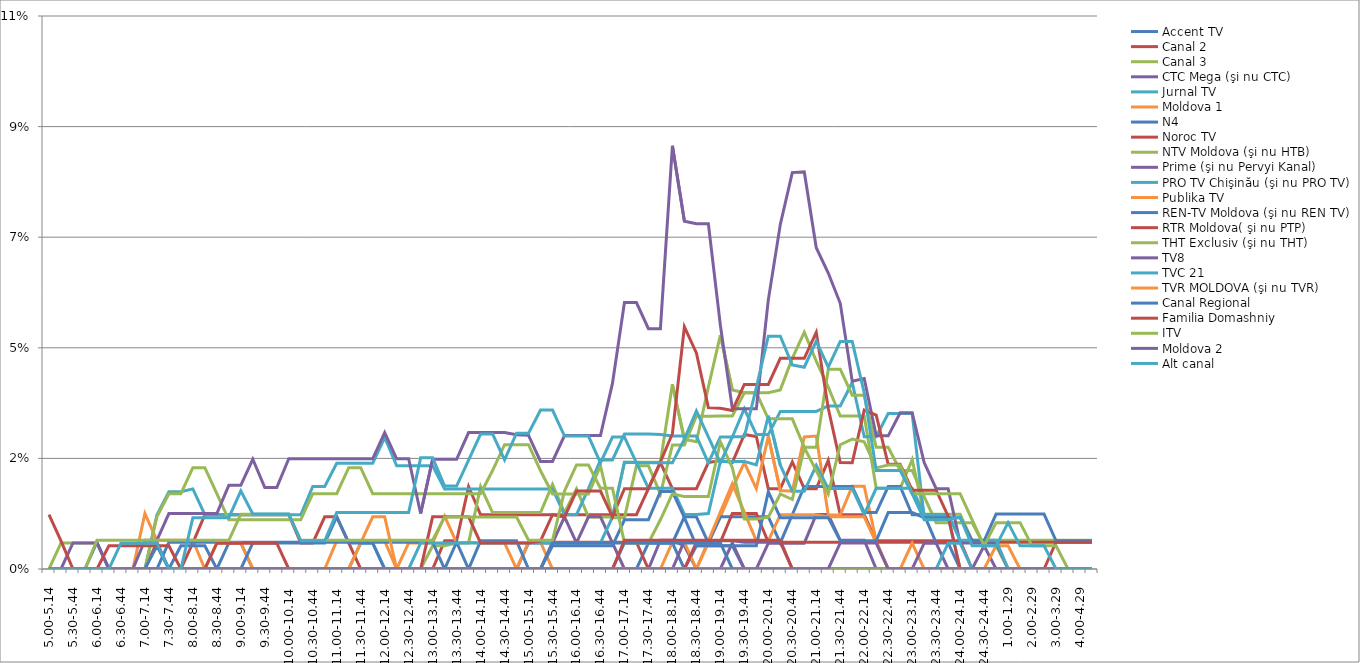
| Category | Accent TV | Canal 2 | Canal 3 | CTC Mega (şi nu CTC) | Jurnal TV | Moldova 1 | N4 | Noroc TV | NTV Moldova (şi nu HTB) | Prime (şi nu Pervyi Kanal) | PRO TV Chişinău (şi nu PRO TV) | Publika TV  | REN-TV Moldova (şi nu REN TV)  | RTR Moldova( şi nu PTP)  | THT Exclusiv (şi nu THT) | TV8 | TVC 21 | TVR MOLDOVA (şi nu TVR) | Canal Regional | Familia Domashniy | ITV | Moldova 2 | Alt canal |
|---|---|---|---|---|---|---|---|---|---|---|---|---|---|---|---|---|---|---|---|---|---|---|---|
| 5.00-5.14 | 0 | 0 | 0 | 0 | 0 | 0 | 0 | 0 | 0 | 0 | 0 | 0 | 0 | 0.011 | 0 | 0 | 0 | 0 | 0 | 0 | 0 | 0 | 0 |
| 5.15-5.29 | 0 | 0 | 0.005 | 0 | 0 | 0 | 0 | 0 | 0 | 0 | 0 | 0 | 0 | 0.006 | 0 | 0 | 0 | 0 | 0 | 0 | 0 | 0 | 0 |
| 5.30-5.44 | 0 | 0 | 0.005 | 0 | 0 | 0 | 0 | 0 | 0 | 0.005 | 0 | 0 | 0 | 0 | 0 | 0 | 0 | 0 | 0 | 0 | 0 | 0 | 0 |
| 5.45-5.59 | 0 | 0 | 0.005 | 0 | 0 | 0 | 0 | 0 | 0 | 0.005 | 0 | 0 | 0 | 0 | 0 | 0 | 0 | 0 | 0 | 0 | 0 | 0 | 0 |
| 6.00-6.14 | 0 | 0 | 0.005 | 0 | 0 | 0 | 0.005 | 0 | 0 | 0.005 | 0 | 0 | 0 | 0 | 0.006 | 0 | 0 | 0 | 0 | 0 | 0 | 0 | 0 |
| 6.15-6.29 | 0 | 0 | 0 | 0 | 0 | 0 | 0 | 0 | 0 | 0 | 0 | 0 | 0 | 0.005 | 0.006 | 0 | 0 | 0 | 0 | 0 | 0 | 0 | 0 |
| 6.30-6.44 | 0 | 0 | 0 | 0 | 0 | 0 | 0 | 0 | 0 | 0 | 0 | 0 | 0 | 0.005 | 0.006 | 0 | 0 | 0 | 0 | 0 | 0 | 0 | 0.005 |
| 6.45-6.59 | 0 | 0 | 0 | 0 | 0 | 0 | 0 | 0 | 0 | 0 | 0 | 0 | 0 | 0.005 | 0.006 | 0 | 0 | 0 | 0 | 0 | 0 | 0 | 0.005 |
| 7.00-7.14 | 0 | 0 | 0 | 0 | 0 | 0.011 | 0 | 0 | 0 | 0.006 | 0 | 0 | 0 | 0.005 | 0.006 | 0 | 0 | 0 | 0 | 0 | 0 | 0 | 0.005 |
| 7.15-7.29 | 0 | 0 | 0 | 0 | 0.011 | 0.006 | 0 | 0.005 | 0.011 | 0.006 | 0 | 0 | 0.005 | 0.005 | 0.006 | 0 | 0 | 0 | 0 | 0 | 0 | 0 | 0.005 |
| 7.30-7.44 | 0 | 0 | 0 | 0 | 0.016 | 0.006 | 0.005 | 0 | 0.015 | 0.011 | 0 | 0 | 0 | 0.005 | 0.006 | 0 | 0 | 0 | 0 | 0 | 0 | 0 | 0 |
| 7.45-7.59 | 0 | 0 | 0 | 0 | 0.016 | 0.006 | 0.005 | 0 | 0.015 | 0.011 | 0 | 0 | 0.005 | 0 | 0.006 | 0 | 0 | 0 | 0 | 0 | 0 | 0 | 0 |
| 8.00-8.14 | 0 | 0.005 | 0 | 0 | 0.016 | 0.006 | 0.005 | 0 | 0.021 | 0.011 | 0 | 0 | 0.005 | 0 | 0.006 | 0 | 0 | 0 | 0 | 0 | 0 | 0 | 0.01 |
| 8.15-8.29 | 0 | 0.011 | 0 | 0 | 0.011 | 0 | 0.005 | 0 | 0.021 | 0.011 | 0 | 0 | 0.005 | 0 | 0.006 | 0 | 0 | 0 | 0 | 0 | 0 | 0 | 0.01 |
| 8.30-8.44 | 0 | 0.011 | 0 | 0 | 0.011 | 0 | 0.005 | 0 | 0.015 | 0.011 | 0 | 0.005 | 0 | 0.005 | 0.006 | 0 | 0 | 0 | 0 | 0 | 0 | 0 | 0.01 |
| 8.45-8.59 | 0.005 | 0.011 | 0 | 0 | 0.011 | 0 | 0.005 | 0 | 0.01 | 0.017 | 0 | 0.005 | 0 | 0.005 | 0.006 | 0 | 0 | 0 | 0 | 0 | 0 | 0 | 0.01 |
| 9.00-9.14 | 0.005 | 0.011 | 0 | 0 | 0.011 | 0 | 0.005 | 0 | 0.01 | 0.017 | 0 | 0.005 | 0 | 0.005 | 0.011 | 0 | 0 | 0 | 0 | 0 | 0 | 0 | 0.016 |
| 9.15-9.29 | 0 | 0.011 | 0 | 0 | 0.011 | 0 | 0.005 | 0 | 0.01 | 0.022 | 0 | 0 | 0.005 | 0.005 | 0.011 | 0 | 0 | 0 | 0 | 0 | 0 | 0 | 0.011 |
| 9.30-9.44 | 0 | 0.011 | 0 | 0 | 0.011 | 0 | 0.005 | 0 | 0.01 | 0.017 | 0 | 0 | 0.005 | 0.005 | 0.011 | 0 | 0 | 0 | 0 | 0 | 0 | 0 | 0.011 |
| 9.45-9.59 | 0 | 0.011 | 0 | 0 | 0.011 | 0 | 0.005 | 0 | 0.01 | 0.017 | 0 | 0 | 0.005 | 0.005 | 0.011 | 0 | 0 | 0 | 0 | 0 | 0 | 0 | 0.011 |
| 10.00-10.14 | 0 | 0.011 | 0 | 0 | 0.011 | 0 | 0.005 | 0 | 0.01 | 0.022 | 0 | 0 | 0.005 | 0 | 0.011 | 0 | 0 | 0 | 0 | 0 | 0 | 0 | 0.011 |
| 10.15-10.29 | 0 | 0.005 | 0 | 0 | 0.011 | 0 | 0.005 | 0 | 0.01 | 0.022 | 0 | 0 | 0.005 | 0 | 0.006 | 0 | 0 | 0 | 0 | 0 | 0 | 0 | 0.006 |
| 10.30-10.44 | 0 | 0.005 | 0 | 0 | 0.017 | 0 | 0.005 | 0 | 0.015 | 0.022 | 0 | 0 | 0.005 | 0 | 0.006 | 0 | 0 | 0 | 0 | 0 | 0 | 0 | 0.006 |
| 10.45-10.59 | 0 | 0.011 | 0 | 0 | 0.017 | 0 | 0.005 | 0 | 0.015 | 0.022 | 0 | 0 | 0.005 | 0 | 0.006 | 0 | 0 | 0 | 0 | 0 | 0 | 0 | 0.006 |
| 11.00-11.14 | 0 | 0.011 | 0 | 0 | 0.021 | 0.006 | 0.005 | 0 | 0.015 | 0.022 | 0 | 0 | 0.011 | 0 | 0.006 | 0 | 0 | 0 | 0 | 0 | 0 | 0 | 0.011 |
| 11.15-11.29 | 0 | 0.005 | 0 | 0 | 0.021 | 0.006 | 0.005 | 0 | 0.021 | 0.022 | 0 | 0 | 0.005 | 0 | 0.006 | 0 | 0 | 0 | 0 | 0 | 0 | 0 | 0.011 |
| 11.30-11.44 | 0 | 0 | 0 | 0 | 0.021 | 0.006 | 0.005 | 0 | 0.021 | 0.022 | 0.005 | 0.005 | 0.005 | 0 | 0.006 | 0 | 0 | 0 | 0 | 0 | 0 | 0 | 0.011 |
| 11.45-11.59 | 0 | 0 | 0 | 0 | 0.021 | 0.006 | 0.005 | 0 | 0.015 | 0.022 | 0.005 | 0.011 | 0.005 | 0 | 0.006 | 0 | 0 | 0 | 0 | 0 | 0 | 0 | 0.011 |
| 12.00-12.14 | 0 | 0 | 0 | 0 | 0.027 | 0.006 | 0.005 | 0 | 0.015 | 0.028 | 0 | 0.011 | 0 | 0 | 0.006 | 0 | 0 | 0 | 0 | 0 | 0 | 0 | 0.011 |
| 12.15-12.29 | 0 | 0 | 0 | 0 | 0.021 | 0 | 0.005 | 0 | 0.015 | 0.022 | 0 | 0 | 0 | 0 | 0.006 | 0 | 0 | 0 | 0 | 0 | 0 | 0 | 0.011 |
| 12.30-12.44 | 0 | 0 | 0 | 0 | 0.021 | 0.005 | 0.005 | 0 | 0.015 | 0.022 | 0 | 0 | 0 | 0 | 0.006 | 0 | 0 | 0 | 0 | 0 | 0 | 0 | 0.011 |
| 12.45-12.59 | 0 | 0 | 0 | 0 | 0.021 | 0.005 | 0.005 | 0 | 0.015 | 0.011 | 0.005 | 0 | 0 | 0 | 0.006 | 0 | 0 | 0 | 0 | 0 | 0 | 0 | 0.023 |
| 13.00-13.14 | 0 | 0 | 0.005 | 0 | 0.021 | 0.005 | 0.005 | 0 | 0.015 | 0.022 | 0.005 | 0 | 0 | 0.011 | 0.006 | 0 | 0 | 0 | 0 | 0 | 0 | 0 | 0.023 |
| 13.15-13.29 | 0 | 0.006 | 0.005 | 0 | 0.016 | 0.011 | 0 | 0 | 0.015 | 0.022 | 0.005 | 0 | 0 | 0.011 | 0.011 | 0 | 0 | 0 | 0 | 0 | 0 | 0 | 0.017 |
| 13.30-13.44 | 0 | 0.006 | 0.005 | 0 | 0.016 | 0.005 | 0.005 | 0 | 0.015 | 0.022 | 0.005 | 0 | 0 | 0.011 | 0.011 | 0 | 0 | 0 | 0 | 0 | 0 | 0 | 0.017 |
| 13.45-13.59 | 0 | 0.017 | 0.005 | 0 | 0.016 | 0.005 | 0 | 0 | 0.015 | 0.028 | 0.005 | 0 | 0 | 0.011 | 0.011 | 0 | 0 | 0 | 0 | 0 | 0 | 0 | 0.022 |
| 14.00-14.14 | 0 | 0.011 | 0.017 | 0 | 0.016 | 0.005 | 0.006 | 0 | 0.015 | 0.028 | 0.005 | 0 | 0 | 0.005 | 0.011 | 0 | 0 | 0 | 0 | 0 | 0 | 0 | 0.027 |
| 14.15-14.29 | 0 | 0.011 | 0.011 | 0 | 0.016 | 0.005 | 0.006 | 0 | 0.02 | 0.028 | 0.005 | 0 | 0 | 0.005 | 0.011 | 0 | 0 | 0 | 0 | 0 | 0 | 0 | 0.027 |
| 14.30-14.44 | 0 | 0.011 | 0.011 | 0 | 0.016 | 0.005 | 0.006 | 0 | 0.025 | 0.028 | 0.005 | 0 | 0 | 0.005 | 0.011 | 0 | 0 | 0 | 0 | 0 | 0 | 0 | 0.022 |
| 14.45-14.59 | 0 | 0.011 | 0.011 | 0 | 0.016 | 0 | 0.006 | 0 | 0.025 | 0.027 | 0.005 | 0 | 0 | 0.005 | 0.011 | 0 | 0 | 0 | 0 | 0 | 0 | 0 | 0.028 |
| 15.00-15.14 | 0 | 0.011 | 0.011 | 0.005 | 0.016 | 0.005 | 0 | 0 | 0.025 | 0.027 | 0.005 | 0 | 0 | 0.005 | 0.006 | 0 | 0 | 0 | 0 | 0 | 0 | 0 | 0.028 |
| 15.15-15.29 | 0 | 0.011 | 0.011 | 0.005 | 0.016 | 0.005 | 0 | 0 | 0.02 | 0.022 | 0.005 | 0 | 0 | 0.006 | 0.006 | 0 | 0 | 0 | 0 | 0 | 0 | 0 | 0.032 |
| 15.30-15.44 | 0 | 0.011 | 0.017 | 0.005 | 0.016 | 0 | 0 | 0.005 | 0.015 | 0.022 | 0.005 | 0 | 0.005 | 0.011 | 0.006 | 0 | 0 | 0 | 0.005 | 0 | 0 | 0 | 0.032 |
| 15.45-15.59 | 0 | 0.011 | 0.011 | 0.011 | 0.011 | 0 | 0 | 0.005 | 0.015 | 0.027 | 0.005 | 0 | 0.005 | 0.011 | 0.016 | 0 | 0 | 0 | 0.005 | 0 | 0 | 0 | 0.027 |
| 16.00-16.14 | 0 | 0.011 | 0.016 | 0.005 | 0.011 | 0 | 0 | 0.005 | 0.015 | 0.027 | 0.005 | 0 | 0.005 | 0.016 | 0.021 | 0 | 0 | 0 | 0.005 | 0 | 0 | 0 | 0.027 |
| 16.15-16.29 | 0 | 0.011 | 0.011 | 0.011 | 0.016 | 0 | 0 | 0.005 | 0.015 | 0.027 | 0.005 | 0 | 0.005 | 0.016 | 0.021 | 0 | 0 | 0 | 0.005 | 0 | 0 | 0 | 0.027 |
| 16.30-16.44 | 0 | 0.011 | 0.011 | 0.011 | 0.022 | 0 | 0 | 0.005 | 0.021 | 0.027 | 0.005 | 0 | 0.005 | 0.016 | 0.016 | 0 | 0 | 0 | 0.005 | 0 | 0 | 0 | 0.022 |
| 16.45-16.59 | 0 | 0.011 | 0.011 | 0.005 | 0.022 | 0 | 0 | 0.005 | 0.01 | 0.038 | 0.011 | 0 | 0.005 | 0.011 | 0.016 | 0 | 0 | 0 | 0.005 | 0 | 0 | 0 | 0.027 |
| 17.00-17.14 | 0.005 | 0.011 | 0.022 | 0 | 0.027 | 0 | 0 | 0.005 | 0.01 | 0.054 | 0.022 | 0 | 0.01 | 0.016 | 0.005 | 0 | 0 | 0 | 0.005 | 0.006 | 0 | 0 | 0.027 |
| 17.15-17.29 | 0.005 | 0.011 | 0.022 | 0 | 0.027 | 0 | 0 | 0.005 | 0.021 | 0.054 | 0.022 | 0 | 0.01 | 0.016 | 0.005 | 0 | 0 | 0 | 0.005 | 0.006 | 0 | 0 | 0.022 |
| 17.30-17.44 | 0.005 | 0.016 | 0.022 | 0 | 0.027 | 0 | 0.005 | 0 | 0.021 | 0.049 | 0.016 | 0 | 0.01 | 0.016 | 0.005 | 0 | 0 | 0 | 0.005 | 0.006 | 0 | 0 | 0.022 |
| 17.45-17.59 | 0.005 | 0.022 | 0.022 | 0.006 | 0.027 | 0 | 0.005 | 0 | 0.015 | 0.049 | 0.016 | 0 | 0.016 | 0.022 | 0.01 | 0 | 0 | 0 | 0.005 | 0.006 | 0 | 0 | 0.022 |
| 18.00-18.14 | 0.005 | 0.016 | 0.038 | 0.006 | 0.027 | 0.005 | 0.005 | 0 | 0.025 | 0.086 | 0.016 | 0 | 0.016 | 0.028 | 0.015 | 0 | 0 | 0 | 0.005 | 0.006 | 0 | 0 | 0.022 |
| 18.15-18.29 | 0 | 0.016 | 0.026 | 0.005 | 0.027 | 0.005 | 0.011 | 0 | 0.025 | 0.071 | 0.011 | 0 | 0.01 | 0.049 | 0.015 | 0.006 | 0 | 0 | 0.005 | 0.006 | 0 | 0 | 0.026 |
| 18.30-18.44 | 0.005 | 0.016 | 0.026 | 0 | 0.027 | 0 | 0.011 | 0.005 | 0.031 | 0.07 | 0.011 | 0 | 0.005 | 0.044 | 0.015 | 0.006 | 0 | 0 | 0.005 | 0.006 | 0 | 0 | 0.032 |
| 18.45-18.59 | 0.005 | 0.022 | 0.037 | 0 | 0.022 | 0.005 | 0.005 | 0.005 | 0.031 | 0.07 | 0.011 | 0.006 | 0.005 | 0.033 | 0.015 | 0.006 | 0 | 0 | 0.005 | 0.006 | 0 | 0 | 0.027 |
| 19.00-19.14 | 0.005 | 0.022 | 0.048 | 0 | 0.027 | 0.011 | 0.011 | 0.005 | 0.031 | 0.05 | 0.022 | 0.012 | 0.005 | 0.033 | 0.026 | 0.006 | 0 | 0 | 0.005 | 0.006 | 0 | 0 | 0.022 |
| 19.15-19.29 | 0.005 | 0.022 | 0.036 | 0.005 | 0.027 | 0.016 | 0.011 | 0.011 | 0.031 | 0.033 | 0.022 | 0.017 | 0.005 | 0.032 | 0.021 | 0.006 | 0 | 0 | 0 | 0.006 | 0 | 0 | 0.027 |
| 19.30-19.44 | 0 | 0.027 | 0.036 | 0 | 0.033 | 0.022 | 0.011 | 0.011 | 0.036 | 0.033 | 0.022 | 0.012 | 0.005 | 0.038 | 0.01 | 0.005 | 0 | 0 | 0 | 0.006 | 0 | 0 | 0.027 |
| 19.45-19.59 | 0 | 0.027 | 0.036 | 0 | 0.027 | 0.016 | 0.011 | 0.011 | 0.036 | 0.033 | 0.021 | 0.006 | 0.005 | 0.038 | 0.01 | 0.005 | 0 | 0 | 0 | 0.006 | 0 | 0 | 0.037 |
| 20.00-20.14 | 0 | 0.016 | 0.036 | 0.005 | 0.027 | 0.027 | 0.011 | 0.005 | 0.031 | 0.055 | 0.031 | 0.006 | 0.016 | 0.038 | 0.011 | 0.005 | 0 | 0 | 0 | 0.006 | 0 | 0 | 0.047 |
| 20.15-20.29 | 0 | 0.016 | 0.036 | 0.005 | 0.032 | 0.016 | 0.005 | 0.005 | 0.031 | 0.07 | 0.021 | 0.011 | 0.01 | 0.043 | 0.015 | 0.005 | 0 | 0 | 0 | 0.006 | 0 | 0 | 0.047 |
| 20.30-20.44 | 0 | 0.022 | 0.043 | 0.005 | 0.032 | 0.016 | 0.011 | 0.005 | 0.031 | 0.081 | 0.016 | 0.011 | 0.01 | 0.043 | 0.014 | 0 | 0 | 0 | 0 | 0 | 0 | 0 | 0.042 |
| 20.45-20.59 | 0 | 0.016 | 0.048 | 0.005 | 0.032 | 0.027 | 0.017 | 0.005 | 0.025 | 0.081 | 0.016 | 0.011 | 0.01 | 0.043 | 0.025 | 0 | 0 | 0 | 0 | 0 | 0 | 0 | 0.041 |
| 21.00-21.14 | 0 | 0.016 | 0.042 | 0.011 | 0.032 | 0.027 | 0.017 | 0.005 | 0.025 | 0.065 | 0.021 | 0.011 | 0.01 | 0.048 | 0.02 | 0 | 0 | 0 | 0 | 0 | 0 | 0 | 0.046 |
| 21.15-21.29 | 0 | 0.022 | 0.037 | 0.011 | 0.033 | 0.011 | 0.017 | 0.005 | 0.041 | 0.06 | 0.016 | 0.011 | 0.01 | 0.033 | 0.015 | 0 | 0 | 0 | 0 | 0 | 0 | 0 | 0.041 |
| 21.30-21.44 | 0 | 0.011 | 0.031 | 0.006 | 0.033 | 0.011 | 0.017 | 0.005 | 0.041 | 0.054 | 0.016 | 0.011 | 0.006 | 0.022 | 0.025 | 0 | 0 | 0 | 0 | 0 | 0 | 0.005 | 0.046 |
| 21.45-21.59 | 0 | 0.011 | 0.031 | 0.006 | 0.038 | 0.017 | 0.017 | 0.005 | 0.035 | 0.038 | 0.016 | 0.011 | 0.006 | 0.022 | 0.026 | 0 | 0 | 0 | 0 | 0 | 0 | 0.005 | 0.046 |
| 22.00-22.14 | 0 | 0.011 | 0.031 | 0.006 | 0.027 | 0.017 | 0.011 | 0.005 | 0.035 | 0.039 | 0.011 | 0.011 | 0.006 | 0.032 | 0.026 | 0 | 0 | 0 | 0 | 0 | 0 | 0.005 | 0.036 |
| 22.15-22.29 | 0 | 0.006 | 0.016 | 0 | 0.027 | 0.006 | 0.011 | 0.005 | 0.025 | 0.027 | 0.016 | 0.005 | 0.006 | 0.031 | 0.021 | 0 | 0 | 0 | 0 | 0 | 0 | 0.005 | 0.02 |
| 22.30-22.44 | 0 | 0.006 | 0.016 | 0 | 0.032 | 0 | 0.017 | 0.005 | 0.025 | 0.027 | 0.016 | 0 | 0.011 | 0.021 | 0.021 | 0 | 0 | 0 | 0 | 0 | 0 | 0 | 0.02 |
| 22.45-22.59 | 0 | 0.006 | 0.016 | 0 | 0.032 | 0 | 0.017 | 0.005 | 0.02 | 0.032 | 0.016 | 0 | 0.011 | 0.021 | 0.021 | 0 | 0 | 0 | 0 | 0 | 0 | 0 | 0.02 |
| 23.00-23.14 | 0 | 0.006 | 0.022 | 0 | 0.032 | 0 | 0.011 | 0.005 | 0.02 | 0.032 | 0.016 | 0.005 | 0.011 | 0.016 | 0.015 | 0 | 0 | 0 | 0 | 0 | 0 | 0 | 0.015 |
| 23.15-23.29 | 0 | 0.006 | 0.011 | 0 | 0.011 | 0 | 0.011 | 0.005 | 0.015 | 0.022 | 0.011 | 0 | 0.01 | 0.016 | 0.015 | 0.005 | 0 | 0 | 0 | 0 | 0 | 0 | 0.01 |
| 23.30-23.44 | 0 | 0.006 | 0.011 | 0 | 0.011 | 0 | 0.005 | 0.005 | 0.009 | 0.016 | 0.011 | 0 | 0.01 | 0.016 | 0.015 | 0.005 | 0 | 0 | 0 | 0 | 0 | 0 | 0.01 |
| 23.45-23.59 | 0 | 0.006 | 0.011 | 0 | 0.011 | 0 | 0.005 | 0.005 | 0.009 | 0.016 | 0.011 | 0 | 0.01 | 0.011 | 0.015 | 0 | 0.005 | 0 | 0 | 0 | 0 | 0 | 0.01 |
| 24.00-24.14 | 0 | 0.006 | 0.011 | 0 | 0 | 0 | 0 | 0.005 | 0.009 | 0.005 | 0.006 | 0 | 0.01 | 0 | 0.015 | 0 | 0.005 | 0 | 0 | 0 | 0 | 0 | 0.011 |
| 24.15-24.29 | 0 | 0 | 0.006 | 0 | 0 | 0 | 0 | 0.005 | 0.009 | 0.005 | 0.006 | 0 | 0.006 | 0 | 0.01 | 0 | 0 | 0 | 0 | 0 | 0 | 0 | 0.005 |
| 24.30-24.44 | 0 | 0 | 0.006 | 0.005 | 0 | 0 | 0 | 0.005 | 0.005 | 0.005 | 0.006 | 0 | 0.006 | 0 | 0.005 | 0 | 0 | 0 | 0 | 0 | 0 | 0 | 0.005 |
| 24.45-24.59 | 0 | 0 | 0.006 | 0 | 0 | 0.005 | 0 | 0.005 | 0.005 | 0.005 | 0.006 | 0 | 0.011 | 0 | 0.009 | 0 | 0 | 0 | 0 | 0 | 0 | 0 | 0.005 |
| 1.00-1.29 | 0 | 0 | 0.006 | 0 | 0 | 0.005 | 0 | 0.005 | 0 | 0 | 0 | 0 | 0.011 | 0 | 0.009 | 0 | 0 | 0 | 0 | 0 | 0 | 0 | 0.009 |
| 1.30-1. 59 | 0 | 0 | 0.006 | 0 | 0 | 0 | 0 | 0.005 | 0 | 0 | 0 | 0 | 0.011 | 0 | 0.009 | 0 | 0 | 0 | 0 | 0 | 0 | 0 | 0.005 |
| 2.00-2.29 | 0 | 0 | 0.006 | 0 | 0 | 0 | 0 | 0.005 | 0 | 0 | 0 | 0 | 0.011 | 0 | 0.005 | 0 | 0 | 0 | 0 | 0 | 0 | 0 | 0.005 |
| 2.30-2.59 | 0 | 0 | 0.006 | 0 | 0 | 0 | 0 | 0.005 | 0 | 0 | 0 | 0 | 0.011 | 0 | 0.005 | 0 | 0 | 0 | 0 | 0 | 0 | 0 | 0.005 |
| 3.00-3.29 | 0 | 0 | 0.006 | 0 | 0 | 0 | 0 | 0.005 | 0 | 0 | 0 | 0 | 0.006 | 0.005 | 0.005 | 0 | 0 | 0 | 0 | 0 | 0 | 0 | 0 |
| 3.30-3.59 | 0 | 0 | 0.006 | 0 | 0 | 0 | 0 | 0.005 | 0 | 0 | 0 | 0 | 0.006 | 0.005 | 0 | 0 | 0 | 0 | 0 | 0 | 0 | 0 | 0 |
| 4.00-4.29 | 0 | 0 | 0.006 | 0 | 0 | 0 | 0 | 0.005 | 0 | 0 | 0 | 0 | 0.006 | 0.005 | 0 | 0 | 0 | 0 | 0 | 0 | 0 | 0 | 0 |
| 4.30-4.59 | 0 | 0 | 0.006 | 0 | 0 | 0 | 0 | 0.005 | 0 | 0 | 0 | 0 | 0.006 | 0.005 | 0 | 0 | 0 | 0 | 0 | 0 | 0 | 0 | 0 |